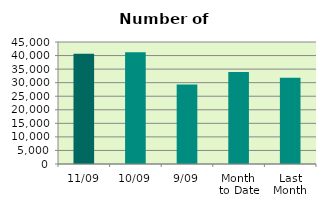
| Category | Series 0 |
|---|---|
| 11/09 | 40654 |
| 10/09 | 41196 |
| 9/09 | 29298 |
| Month 
to Date | 33958.25 |
| Last
Month | 31813.182 |